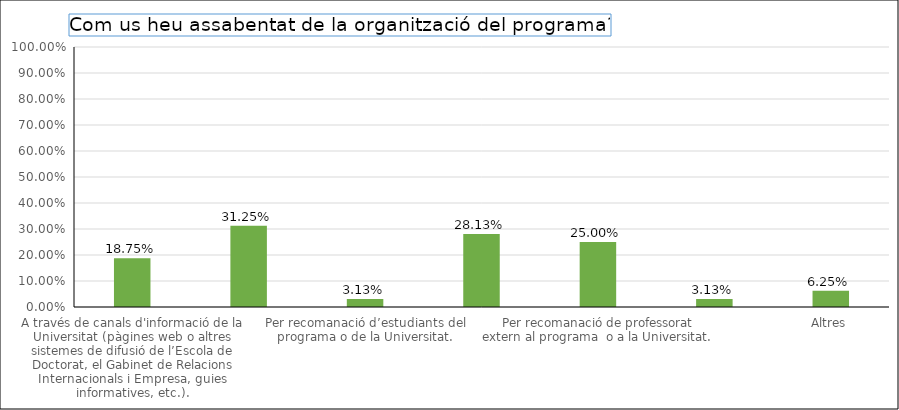
| Category | Series 0 |
|---|---|
| A través de canals d'informació de la Universitat (pàgines web o altres sistemes de difusió de l’Escola de Doctorat, el Gabinet de Relacions Internacionals i Empresa, guies informatives, etc.). | 0.188 |
| A través del departament o de l'institut (pàgines web pròpies i altres sistemes de difusió). | 0.312 |
| Per recomanació d’estudiants del programa o de la Universitat. | 0.031 |
| Per recomanació de professorat del programa o de la Universitat. | 0.281 |
| Per recomanació de professorat extern al programa  o a la Universitat. | 0.25 |
| Webs especialitzats. | 0.031 |
| Altres | 0.062 |